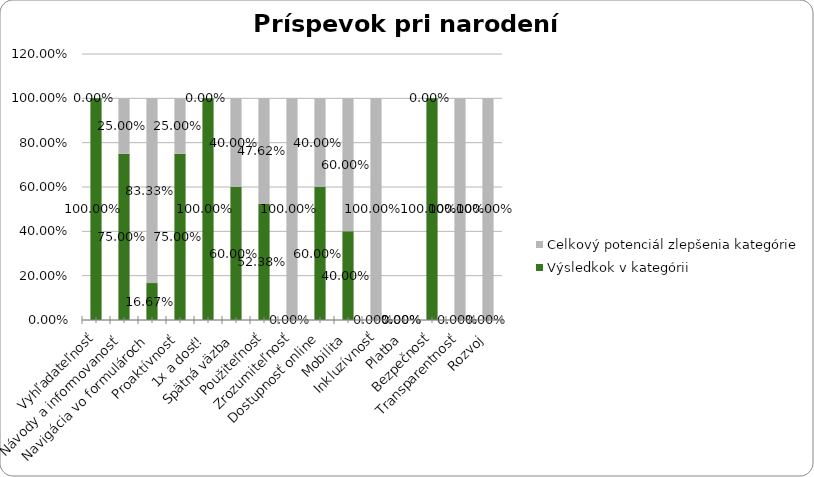
| Category | Výsledkok v kategórii | Celkový potenciál zlepšenia kategórie |
|---|---|---|
| Vyhľadateľnosť | 1 | 0 |
| Návody a informovanosť | 0.75 | 0.25 |
| Navigácia vo formulároch | 0.167 | 0.833 |
| Proaktívnosť | 0.75 | 0.25 |
| 1x a dosť! | 1 | 0 |
| Spätná väzba | 0.6 | 0.4 |
| Použiteľnosť | 0.524 | 0.476 |
| Zrozumiteľnosť | 0 | 1 |
| Dostupnosť online | 0.6 | 0.4 |
| Mobilita | 0.4 | 0.6 |
| Inkluzívnosť | 0 | 1 |
| Platba | 0 | 0 |
| Bezpečnosť | 1 | 0 |
| Transparentnosť | 0 | 1 |
| Rozvoj | 0 | 1 |